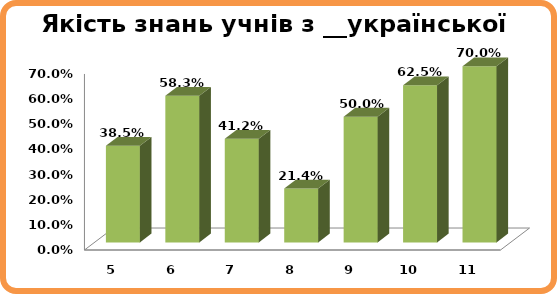
| Category | Series 0 |
|---|---|
| 5.0 | 0.385 |
| 6.0 | 0.583 |
| 7.0 | 0.412 |
| 8.0 | 0.214 |
| 9.0 | 0.5 |
| 10.0 | 0.625 |
| 11.0 | 0.7 |